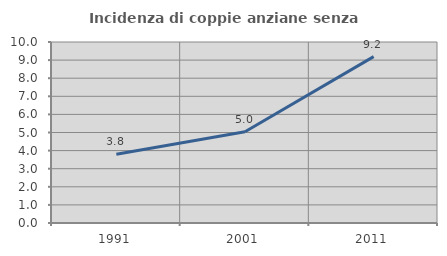
| Category | Incidenza di coppie anziane senza figli  |
|---|---|
| 1991.0 | 3.793 |
| 2001.0 | 5.044 |
| 2011.0 | 9.191 |